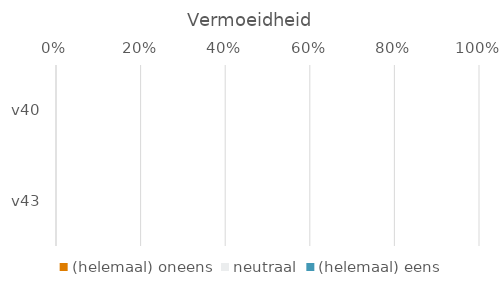
| Category | (helemaal) oneens | neutraal | (helemaal) eens |
|---|---|---|---|
| v40 | 0 | 0 | 0 |
| v43 | 0 | 0 | 0 |